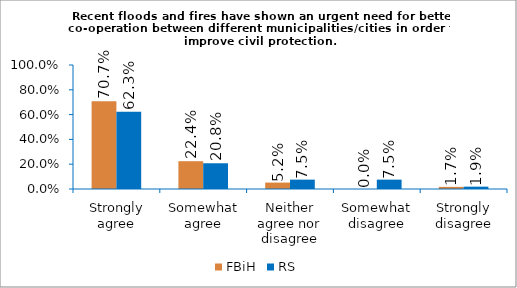
| Category | FBiH | RS |
|---|---|---|
| Strongly agree | 0.707 | 0.623 |
| Somewhat agree | 0.224 | 0.208 |
| Neither agree nor disagree | 0.052 | 0.075 |
| Somewhat disagree | 0 | 0.075 |
| Strongly disagree | 0.017 | 0.019 |